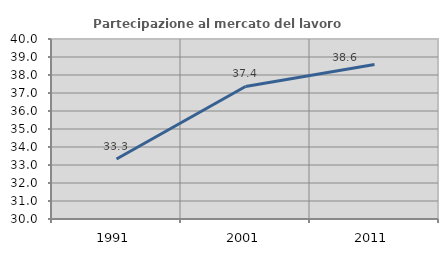
| Category | Partecipazione al mercato del lavoro  femminile |
|---|---|
| 1991.0 | 33.333 |
| 2001.0 | 37.363 |
| 2011.0 | 38.587 |